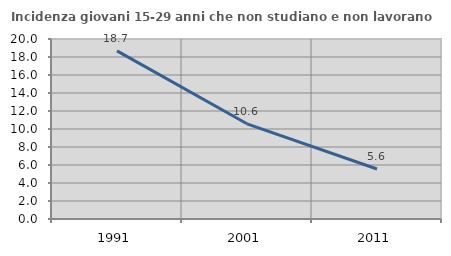
| Category | Incidenza giovani 15-29 anni che non studiano e non lavorano  |
|---|---|
| 1991.0 | 18.686 |
| 2001.0 | 10.577 |
| 2011.0 | 5.556 |